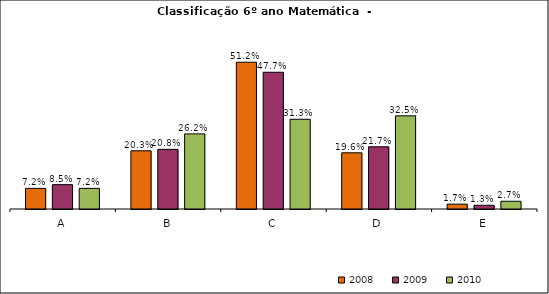
| Category | 2008 | 2009 | 2010 |
|---|---|---|---|
| A | 0.072 | 0.085 | 0.072 |
| B | 0.203 | 0.208 | 0.262 |
| C | 0.512 | 0.477 | 0.313 |
| D | 0.196 | 0.217 | 0.325 |
| E | 0.017 | 0.013 | 0.027 |